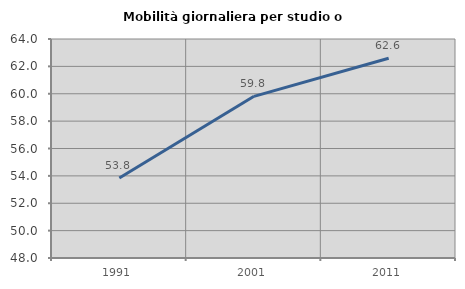
| Category | Mobilità giornaliera per studio o lavoro |
|---|---|
| 1991.0 | 53.846 |
| 2001.0 | 59.811 |
| 2011.0 | 62.597 |